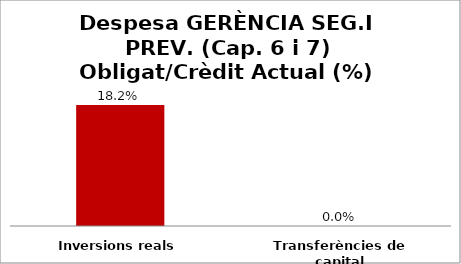
| Category | Series 0 |
|---|---|
| Inversions reals | 0.182 |
| Transferències de capital | 0 |